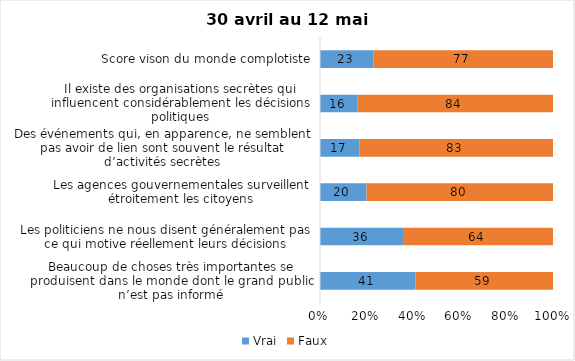
| Category | Vrai | Faux |
|---|---|---|
| Beaucoup de choses très importantes se produisent dans le monde dont le grand public n’est pas informé | 41 | 59 |
| Les politiciens ne nous disent généralement pas ce qui motive réellement leurs décisions | 36 | 64 |
| Les agences gouvernementales surveillent étroitement les citoyens | 20 | 80 |
| Des événements qui, en apparence, ne semblent pas avoir de lien sont souvent le résultat d’activités secrètes | 17 | 83 |
| Il existe des organisations secrètes qui influencent considérablement les décisions politiques | 16 | 84 |
| Score vison du monde complotiste | 23 | 77 |